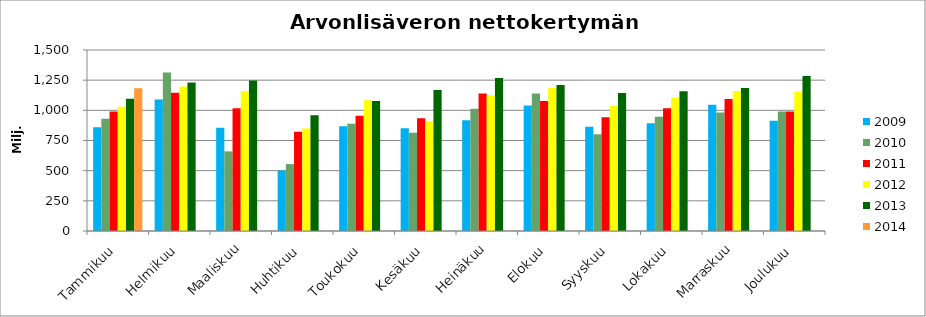
| Category | 2009 | 2010 | 2011 | 2012 | 2013 | 2014 |
|---|---|---|---|---|---|---|
| Tammikuu | 858.934 | 929.369 | 989.979 | 1030.641 | 1096.075 | 1182.963 |
| Helmikuu | 1089.664 | 1313.151 | 1145.438 | 1198.153 | 1230.33 | 0 |
| Maaliskuu | 856.122 | 659.776 | 1016.463 | 1160.067 | 1247.422 | 0 |
| Huhtikuu | 501.743 | 554.255 | 821.506 | 848.926 | 959.001 | 0 |
| Toukokuu | 867.163 | 889.769 | 955.963 | 1083.741 | 1078.37 | 0 |
| Kesäkuu | 851.056 | 814.024 | 933.418 | 909.246 | 1168.206 | 0 |
| Heinäkuu | 918.059 | 1013.537 | 1139.789 | 1122.196 | 1267.424 | 0 |
| Elokuu | 1040.537 | 1139.703 | 1077.137 | 1184.622 | 1210.636 | 0 |
| Syyskuu | 863.546 | 801.068 | 941.737 | 1035.954 | 1142.819 | 0 |
| Lokakuu | 892.063 | 947.674 | 1018.067 | 1107.374 | 1157.981 | 0 |
| Marraskuu | 1046.386 | 981.431 | 1094.661 | 1159.214 | 1185.544 | 0 |
| Joulukuu | 914.348 | 991.049 | 989.325 | 1156.453 | 1284.095 | 0 |